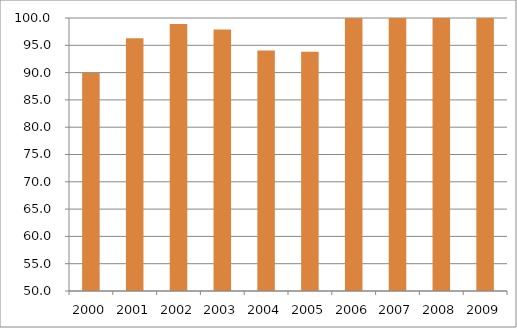
| Category | Região Nordeste |
|---|---|
| 2000.0 | 89.93 |
| 2001.0 | 96.31 |
| 2002.0 | 98.89 |
| 2003.0 | 97.9 |
| 2004.0 | 94.03 |
| 2005.0 | 93.81 |
| 2006.0 | 104.05 |
| 2007.0 | 106.4 |
| 2008.0 | 101.79 |
| 2009.0 | 102.65 |